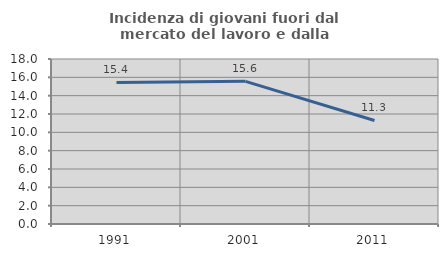
| Category | Incidenza di giovani fuori dal mercato del lavoro e dalla formazione  |
|---|---|
| 1991.0 | 15.447 |
| 2001.0 | 15.561 |
| 2011.0 | 11.294 |